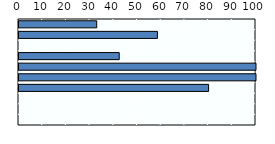
| Category | Payment rate (%) across father-specific leave |
|---|---|
| Korea | 32.794 |
| Japan | 58.407 |
| OECD average (d) | 0 |
| Australia | 42.289 |
| Singapore | 100 |
| Viet Nam | 100 |
| Hong Kong (China) | 80 |
| China | 0 |
| New Zealand | 0 |
| Thailand | 0 |